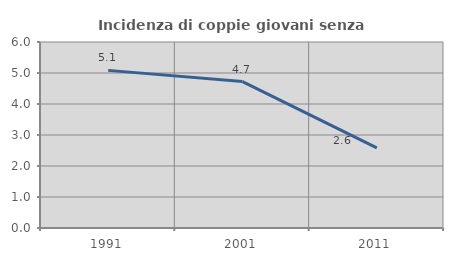
| Category | Incidenza di coppie giovani senza figli |
|---|---|
| 1991.0 | 5.085 |
| 2001.0 | 4.724 |
| 2011.0 | 2.583 |